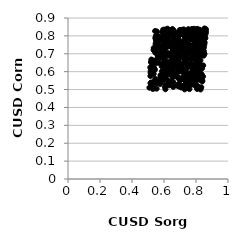
| Category | Series 0 |
|---|---|
| 0.5457226578914693 | 0.79 |
| 0.5820415566814895 | 0.739 |
| 0.6574451764975326 | 0.515 |
| 0.6752550594382059 | 0.803 |
| 0.7130549381380016 | 0.755 |
| 0.5505754176995341 | 0.652 |
| 0.7488513275881186 | 0.717 |
| 0.8416256582278505 | 0.791 |
| 0.723683260445533 | 0.598 |
| 0.7935257288644972 | 0.692 |
| 0.693018027354305 | 0.672 |
| 0.784467930927218 | 0.634 |
| 0.8117410290243743 | 0.713 |
| 0.6580849766439321 | 0.595 |
| 0.7692660674586399 | 0.784 |
| 0.6405592007420011 | 0.583 |
| 0.7277209901649628 | 0.667 |
| 0.7744196884114483 | 0.541 |
| 0.668613444816808 | 0.782 |
| 0.7392412906544054 | 0.597 |
| 0.689508161379329 | 0.569 |
| 0.731924884660142 | 0.809 |
| 0.8248937572480575 | 0.683 |
| 0.5148524658414562 | 0.576 |
| 0.5641696275729025 | 0.751 |
| 0.8037513007634838 | 0.516 |
| 0.7483759412593186 | 0.626 |
| 0.5663074692521712 | 0.649 |
| 0.5499941879436182 | 0.65 |
| 0.7121200630051845 | 0.644 |
| 0.7058212405791672 | 0.834 |
| 0.5937035099978996 | 0.741 |
| 0.8291260168941896 | 0.622 |
| 0.5570148817277782 | 0.796 |
| 0.7141468487834657 | 0.754 |
| 0.6580584887409366 | 0.659 |
| 0.6399307540311069 | 0.808 |
| 0.6925681058426278 | 0.8 |
| 0.7614702906040478 | 0.579 |
| 0.5578501910818092 | 0.79 |
| 0.5394427603922205 | 0.617 |
| 0.7743932370819626 | 0.697 |
| 0.7220183729899539 | 0.811 |
| 0.5455888965109581 | 0.559 |
| 0.7817488615426387 | 0.673 |
| 0.8150313525948676 | 0.636 |
| 0.5501655988925712 | 0.802 |
| 0.5779119782322806 | 0.702 |
| 0.8177974553196619 | 0.683 |
| 0.7369173507866649 | 0.826 |
| 0.5996876197299047 | 0.727 |
| 0.8232861234015729 | 0.584 |
| 0.5421583549383685 | 0.548 |
| 0.8203063983397311 | 0.591 |
| 0.7432944801690256 | 0.508 |
| 0.8026722654339411 | 0.521 |
| 0.7324021082682642 | 0.559 |
| 0.8232832348045411 | 0.727 |
| 0.5556463949286581 | 0.825 |
| 0.7620896380337474 | 0.641 |
| 0.6223724156518007 | 0.74 |
| 0.6401315556109933 | 0.82 |
| 0.8311983168125705 | 0.575 |
| 0.6127117955059027 | 0.647 |
| 0.6096722874639363 | 0.526 |
| 0.571638113350313 | 0.688 |
| 0.8207566657600132 | 0.778 |
| 0.6554024281387867 | 0.772 |
| 0.5907336533650455 | 0.786 |
| 0.6015353490839019 | 0.658 |
| 0.7043214704565222 | 0.761 |
| 0.7778187052440948 | 0.623 |
| 0.589962655403742 | 0.773 |
| 0.6125058261240378 | 0.759 |
| 0.6810460499648323 | 0.645 |
| 0.5351386777890065 | 0.629 |
| 0.7046044673771751 | 0.748 |
| 0.8560215062351673 | 0.796 |
| 0.8112118226193524 | 0.52 |
| 0.7696481851082584 | 0.566 |
| 0.73460007247253 | 0.509 |
| 0.8223389512555741 | 0.788 |
| 0.8090318014074852 | 0.567 |
| 0.7556542803738591 | 0.561 |
| 0.7200901535938342 | 0.572 |
| 0.6028327518208085 | 0.568 |
| 0.6498979735421571 | 0.832 |
| 0.8286975612409831 | 0.577 |
| 0.6349791255831567 | 0.625 |
| 0.8113693694834748 | 0.715 |
| 0.6089561161708308 | 0.502 |
| 0.8064496722266732 | 0.771 |
| 0.8414270815792777 | 0.757 |
| 0.5948114404613527 | 0.835 |
| 0.8351740172883895 | 0.586 |
| 0.8470185200196598 | 0.822 |
| 0.5286461403371234 | 0.642 |
| 0.836226499715456 | 0.724 |
| 0.7889180925463773 | 0.679 |
| 0.6964362518172005 | 0.733 |
| 0.704740798943889 | 0.523 |
| 0.6874071028220665 | 0.676 |
| 0.6327013951077701 | 0.543 |
| 0.6667462719494607 | 0.758 |
| 0.7718375700217853 | 0.714 |
| 0.5855870259741989 | 0.63 |
| 0.5994315803905712 | 0.79 |
| 0.6686731617542627 | 0.725 |
| 0.7056628581224103 | 0.636 |
| 0.8226938736839762 | 0.556 |
| 0.7991582025080584 | 0.677 |
| 0.6792116834227808 | 0.763 |
| 0.6097799660327874 | 0.836 |
| 0.7067010526190458 | 0.719 |
| 0.7880500071993324 | 0.783 |
| 0.6070274973598637 | 0.574 |
| 0.6797144303513258 | 0.522 |
| 0.8060280911832491 | 0.744 |
| 0.5944923998553302 | 0.569 |
| 0.7055036387190643 | 0.523 |
| 0.5167144154654271 | 0.606 |
| 0.7684431915546811 | 0.826 |
| 0.8301815004301825 | 0.555 |
| 0.7358644083941208 | 0.697 |
| 0.6355770242712496 | 0.757 |
| 0.5998937174973021 | 0.799 |
| 0.6610690526595713 | 0.72 |
| 0.5443224519067439 | 0.827 |
| 0.8250639963311653 | 0.643 |
| 0.6343441347901457 | 0.639 |
| 0.8542204190350994 | 0.763 |
| 0.8009249630894547 | 0.734 |
| 0.701712464511115 | 0.553 |
| 0.5968407545011762 | 0.828 |
| 0.8092134369510031 | 0.709 |
| 0.7751363434336973 | 0.82 |
| 0.7703977460090834 | 0.64 |
| 0.602412143621385 | 0.703 |
| 0.7293454715185994 | 0.747 |
| 0.7326885663684408 | 0.758 |
| 0.8519527553697637 | 0.751 |
| 0.74429664049625 | 0.637 |
| 0.6589718991559934 | 0.717 |
| 0.6074626190114201 | 0.794 |
| 0.7303092911457154 | 0.715 |
| 0.5316798145948454 | 0.615 |
| 0.8498805345270116 | 0.736 |
| 0.7037756386627636 | 0.613 |
| 0.6279858290744565 | 0.53 |
| 0.6306680831892935 | 0.628 |
| 0.7923426204302795 | 0.61 |
| 0.5783801617728314 | 0.571 |
| 0.8329304098219796 | 0.513 |
| 0.7157899061074547 | 0.718 |
| 0.6941806884987283 | 0.645 |
| 0.8140350888670429 | 0.678 |
| 0.7528574969121704 | 0.789 |
| 0.7289511681770138 | 0.501 |
| 0.6975802560361317 | 0.766 |
| 0.6545090825566181 | 0.8 |
| 0.5300046211152594 | 0.504 |
| 0.569470798504409 | 0.776 |
| 0.7923019704914944 | 0.698 |
| 0.7821448947220843 | 0.777 |
| 0.8240041782040589 | 0.582 |
| 0.6335262740235029 | 0.529 |
| 0.5382240039686249 | 0.662 |
| 0.7232030528612523 | 0.837 |
| 0.8398929430815486 | 0.55 |
| 0.6221200860546816 | 0.84 |
| 0.756617127246918 | 0.83 |
| 0.5619085718854187 | 0.728 |
| 0.6217228319325869 | 0.705 |
| 0.7891260018829774 | 0.588 |
| 0.7090840532613476 | 0.815 |
| 0.7295319007173267 | 0.785 |
| 0.5199076824365112 | 0.54 |
| 0.6633647408142589 | 0.661 |
| 0.7012200201920786 | 0.723 |
| 0.738580813105093 | 0.662 |
| 0.6181598579368397 | 0.78 |
| 0.5682464536808958 | 0.671 |
| 0.8208228289320129 | 0.51 |
| 0.8128115952784443 | 0.769 |
| 0.7990016938769943 | 0.762 |
| 0.7859702391100623 | 0.638 |
| 0.5933946993905561 | 0.551 |
| 0.5246550163250101 | 0.627 |
| 0.8504443894310971 | 0.767 |
| 0.717387376320967 | 0.73 |
| 0.5925338079033657 | 0.605 |
| 0.6544395240370471 | 0.57 |
| 0.7444861998617047 | 0.572 |
| 0.6062955457466427 | 0.513 |
| 0.8227783438375249 | 0.581 |
| 0.8115050081394497 | 0.638 |
| 0.639344223111258 | 0.619 |
| 0.6884022729648416 | 0.783 |
| 0.7932472437931712 | 0.799 |
| 0.6936436006363742 | 0.813 |
| 0.7351775159769071 | 0.765 |
| 0.6458138273778244 | 0.607 |
| 0.6795080404202227 | 0.75 |
| 0.7215914135102182 | 0.612 |
| 0.6932193575462688 | 0.517 |
| 0.6368434859051253 | 0.542 |
| 0.514160042493545 | 0.624 |
| 0.6576041158151178 | 0.542 |
| 0.7621335626045096 | 0.726 |
| 0.6508112078117776 | 0.712 |
| 0.8160065613895429 | 0.508 |
| 0.7100015617056175 | 0.768 |
| 0.7337705860979025 | 0.65 |
| 0.780740160797371 | 0.599 |
| 0.6907962252388742 | 0.696 |
| 0.6647489516856484 | 0.825 |
| 0.5086555845352292 | 0.51 |
| 0.5357004068542792 | 0.732 |
| 0.7504082187276574 | 0.627 |
| 0.7674915398347391 | 0.593 |
| 0.7636605590644167 | 0.535 |
| 0.6737516958858087 | 0.629 |
| 0.6767633985221474 | 0.704 |
| 0.518940205423245 | 0.653 |
| 0.5872910299345999 | 0.794 |
| 0.6963021674334908 | 0.812 |
| 0.5832067026063025 | 0.71 |
| 0.6030994791616044 | 0.693 |
| 0.5734271380362364 | 0.792 |
| 0.7859343229689043 | 0.689 |
| 0.7952599979824492 | 0.7 |
| 0.7629079511370483 | 0.531 |
| 0.5339597305756433 | 0.588 |
| 0.6394139486975694 | 0.746 |
| 0.6206743735486271 | 0.688 |
| 0.704649081712923 | 0.602 |
| 0.784640023093506 | 0.561 |
| 0.7966208826865359 | 0.549 |
| 0.7731501131860025 | 0.831 |
| 0.7709158109155311 | 0.789 |
| 0.7275372221889764 | 0.59 |
| 0.6728059831532607 | 0.768 |
| 0.7489849105715798 | 0.521 |
| 0.5991716594737471 | 0.594 |
| 0.6140034713718365 | 0.577 |
| 0.5729350254615874 | 0.544 |
| 0.7809462646204444 | 0.539 |
| 0.6131688486460309 | 0.657 |
| 0.5541262416540156 | 0.505 |
| 0.7590754828616135 | 0.502 |
| 0.7686598181268046 | 0.742 |
| 0.6145284328812132 | 0.691 |
| 0.5649471984021953 | 0.534 |
| 0.8154574342041097 | 0.62 |
| 0.7598321685517213 | 0.829 |
| 0.8024852557121498 | 0.737 |
| 0.7512012070861279 | 0.538 |
| 0.8484403197536137 | 0.801 |
| 0.8381324836891018 | 0.811 |
| 0.7902770328779133 | 0.729 |
| 0.8055053134197745 | 0.836 |
| 0.7573843003489542 | 0.817 |
| 0.7946716083134628 | 0.58 |
| 0.6563218226363332 | 0.632 |
| 0.7367507521972351 | 0.537 |
| 0.562991837771626 | 0.669 |
| 0.6377966499974312 | 0.657 |
| 0.534723215199524 | 0.721 |
| 0.8430780405204346 | 0.714 |
| 0.6146173753745332 | 0.77 |
| 0.8487587485391697 | 0.716 |
| 0.5388189035339608 | 0.617 |
| 0.7863585402357585 | 0.526 |
| 0.5484373544758774 | 0.781 |
| 0.8276881254261959 | 0.803 |
| 0.6261683226153498 | 0.614 |
| 0.5819251264557938 | 0.71 |
| 0.639377260748907 | 0.808 |
| 0.7419219571911421 | 0.793 |
| 0.6345557596136235 | 0.832 |
| 0.6209920211432634 | 0.553 |
| 0.8164304735037569 | 0.564 |
| 0.7052827385138507 | 0.741 |
| 0.8184236083612763 | 0.814 |
| 0.6857459586856993 | 0.597 |
| 0.5725995342829608 | 0.691 |
| 0.7484029003236523 | 0.699 |
| 0.7030485930250077 | 0.678 |
| 0.5347649882319792 | 0.589 |
| 0.83884792687884 | 0.545 |
| 0.7345890803913315 | 0.518 |
| 0.7226641959422739 | 0.556 |
| 0.7853798380852879 | 0.795 |
| 0.6067636700595906 | 0.649 |
| 0.7185031711311807 | 0.707 |
| 0.7515986636866785 | 0.672 |
| 0.7564218031383423 | 0.731 |
| 0.748161755578695 | 0.528 |
| 0.7202545400793892 | 0.83 |
| 0.5765384960217534 | 0.531 |
| 0.7893576199131072 | 0.616 |
| 0.704768664331455 | 0.733 |
| 0.6482495891239841 | 0.681 |
| 0.8219265795129762 | 0.68 |
| 0.7222598622249133 | 0.518 |
| 0.5881596806969869 | 0.821 |
| 0.6270958874658681 | 0.819 |
| 0.788833704724099 | 0.84 |
| 0.7386394748302694 | 0.817 |
| 0.8607986164784189 | 0.813 |
| 0.5471126083638143 | 0.756 |
| 0.7329926062301941 | 0.706 |
| 0.687914211849169 | 0.652 |
| 0.6859344851542606 | 0.62 |
| 0.7072568770247014 | 0.512 |
| 0.7524439383659012 | 0.514 |
| 0.595269876609414 | 0.722 |
| 0.648290209828648 | 0.798 |
| 0.8515110039284193 | 0.84 |
| 0.8221107040927301 | 0.602 |
| 0.632431793162139 | 0.524 |
| 0.5502608873071357 | 0.772 |
| 0.8086103625012645 | 0.723 |
| 0.7126590128747636 | 0.624 |
| 0.5776132802893417 | 0.58 |
| 0.6125268138490501 | 0.734 |
| 0.5460114812361078 | 0.535 |
| 0.7415865172290823 | 0.823 |
| 0.7276898966704057 | 0.761 |
| 0.756072999874384 | 0.752 |
| 0.6848773386886298 | 0.704 |
| 0.8623340319744193 | 0.837 |
| 0.8288662566513342 | 0.501 |
| 0.6862774990478859 | 0.66 |
| 0.5233252085184212 | 0.666 |
| 0.8384968472326244 | 0.619 |
| 0.6641857316615347 | 0.721 |
| 0.7517861152247981 | 0.838 |
| 0.8551685982709638 | 0.829 |
| 0.5619667239534007 | 0.687 |
| 0.5490399125217993 | 0.656 |
| 0.5877374580250732 | 0.603 |
| 0.6724643111528634 | 0.578 |
| 0.6878997740774873 | 0.815 |
| 0.8067732555838519 | 0.504 |
| 0.7785102826935196 | 0.807 |
| 0.6530151640653311 | 0.834 |
| 0.7322183510233999 | 0.68 |
| 0.8437507226855188 | 0.76 |
| 0.8031920071403675 | 0.55 |
| 0.7734615877287252 | 0.622 |
| 0.5949257550737546 | 0.646 |
| 0.8452284166749936 | 0.635 |
| 0.6564466462804686 | 0.608 |
| 0.7951505244677036 | 0.819 |
| 0.7771679580959236 | 0.778 |
| 0.803768960878066 | 0.611 |
| 0.7815326463132889 | 0.694 |
| 0.5205654076008717 | 0.653 |
| 0.6975652826195327 | 0.606 |
| 0.8237630451235914 | 0.685 |
| 0.7609557866189458 | 0.802 |
| 0.7728266927948604 | 0.729 |
| 0.8358456183676253 | 0.562 |
| 0.6947044286476958 | 0.77 |
| 0.7230436636853336 | 0.803 |
| 0.542821673912655 | 0.611 |
| 0.5455983620161731 | 0.706 |
| 0.8270981264145092 | 0.565 |
| 0.7886069924165007 | 0.749 |
| 0.8048194589147859 | 0.692 |
| 0.7100019668733535 | 0.828 |
| 0.8332790626734656 | 0.765 |
| 0.6371612079947522 | 0.643 |
| 0.6981213424816672 | 0.833 |
| 0.6004887362548237 | 0.596 |
| 0.5948681329729582 | 0.676 |
| 0.7945386025153928 | 0.786 |
| 0.6038277636597874 | 0.806 |
| 0.5161646932606971 | 0.593 |
| 0.7642852394485605 | 0.78 |
| 0.6812570315621067 | 0.674 |
| 0.5636195302312045 | 0.668 |
| 0.5988894712729851 | 0.804 |
| 0.8441713856480073 | 0.573 |
| 0.8277555170974579 | 0.663 |
| 0.8317397841537575 | 0.822 |
| 0.7730419946070501 | 0.548 |
| 0.5733308637842992 | 0.775 |
| 0.8080409108130819 | 0.839 |
| 0.8127897579538365 | 0.809 |
| 0.6608917135635834 | 0.592 |
| 0.7668192420988535 | 0.647 |
| 0.7326467273542978 | 0.777 |
| 0.6894780925548636 | 0.754 |
| 0.6256431335432211 | 0.787 |
| 0.6830829956703457 | 0.764 |
| 0.7227681175314169 | 0.517 |
| 0.5152761588656892 | 0.536 |
| 0.805014000849079 | 0.781 |
| 0.6243712618881774 | 0.775 |
| 0.6576707187331309 | 0.833 |
| 0.8003866148181742 | 0.655 |
| 0.8214052574608272 | 0.835 |
| 0.6692738375777351 | 0.686 |
| 0.7180494660637713 | 0.766 |
| 0.8417731855894902 | 0.818 |
| 0.7479666085831242 | 0.754 |
| 0.797407691792362 | 0.72 |
| 0.5209554661811718 | 0.668 |
| 0.568766243100582 | 0.552 |
| 0.7679479439605994 | 0.744 |
| 0.6442964152067754 | 0.604 |
| 0.6343175806399476 | 0.609 |
| 0.8207034948200621 | 0.739 |
| 0.8625264830718247 | 0.824 |
| 0.6030922292378592 | 0.726 |
| 0.8460924823271722 | 0.793 |
| 0.7583960775258465 | 0.821 |
| 0.6839322880085776 | 0.665 |
| 0.6743234998418219 | 0.805 |
| 0.538954734360251 | 0.507 |
| 0.5692681559365471 | 0.696 |
| 0.7221161839395289 | 0.747 |
| 0.5645242346989107 | 0.547 |
| 0.564062247615388 | 0.682 |
| 0.7635927402921954 | 0.525 |
| 0.6067874550017356 | 0.774 |
| 0.6858620669372756 | 0.76 |
| 0.6794580035734124 | 0.797 |
| 0.5657684694025548 | 0.671 |
| 0.6627981882669833 | 0.631 |
| 0.8256910719862036 | 0.831 |
| 0.5989001749749809 | 0.633 |
| 0.7986508226294127 | 0.827 |
| 0.6456223234780167 | 0.701 |
| 0.8204601310790988 | 0.784 |
| 0.8093472589968301 | 0.666 |
| 0.5606487086831963 | 0.669 |
| 0.85314540720767 | 0.699 |
| 0.563982392568027 | 0.798 |
| 0.6446193186307855 | 0.737 |
| 0.8509242326432214 | 0.816 |
| 0.8480386475083374 | 0.69 |
| 0.5826157152860048 | 0.558 |
| 0.8135316942410126 | 0.806 |
| 0.8587725403675055 | 0.787 |
| 0.5660907290996755 | 0.779 |
| 0.8091661698732484 | 0.633 |
| 0.6923408732149952 | 0.532 |
| 0.7141274026822801 | 0.56 |
| 0.5869258148793042 | 0.694 |
| 0.5289339604368046 | 0.506 |
| 0.5530213752237473 | 0.749 |
| 0.7750162632923847 | 0.839 |
| 0.6068182100727741 | 0.584 |
| 0.8208079241394503 | 0.816 |
| 0.6721725916498051 | 0.654 |
| 0.7339093187652994 | 0.664 |
| 0.7963330858318869 | 0.774 |
| 0.8236703851280207 | 0.703 |
| 0.7660062553136326 | 0.54 |
| 0.7952891356952123 | 0.608 |
| 0.616500215084469 | 0.614 |
| 0.5669306638765448 | 0.685 |
| 0.7508407896840169 | 0.533 |
| 0.8547684890947671 | 0.841 |
| 0.6692511042509663 | 0.735 |
| 0.8278311251026046 | 0.743 |
| 0.6270877386633977 | 0.6 |
| 0.6428706470037526 | 0.586 |
| 0.6390007689024498 | 0.818 |
| 0.6821036136781995 | 0.659 |
| 0.8342446762905811 | 0.823 |
| 0.5889480376004621 | 0.746 |
| 0.6350696125656192 | 0.745 |
| 0.8036715498508952 | 0.6 |
| 0.8262761779174975 | 0.709 |
| 0.7139217201681605 | 0.684 |
| 0.561544528410237 | 0.771 |
| 0.5208693847886294 | 0.528 |
| 0.7440762348824328 | 0.557 |
| 0.8356363368667863 | 0.565 |
| 0.643667801135827 | 0.546 |
| 0.844204745435094 | 0.732 |
| 0.8363012716675765 | 0.708 |
| 0.815700625246143 | 0.811 |
| 0.7755844416859905 | 0.742 |
| 0.7504536177301138 | 0.738 |
| 0.7359931333898126 | 0.711 |
| 0.7512955853304144 | 0.806 |
| 0.7707794230699487 | 0.674 |
| 0.7423476848670729 | 0.81 |
| 0.6402986486824354 | 0.585 |
| 0.7524720671889205 | 0.591 |
| 0.652160844586112 | 0.838 |
| 0.6433733865118858 | 0.753 |
| 0.6466018636962972 | 0.813 |
| 0.8355596132039821 | 0.795 |
| 0.6887997228145153 | 0.563 |